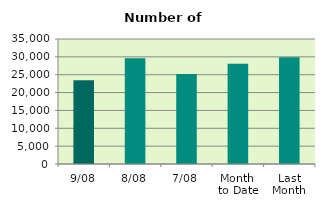
| Category | Series 0 |
|---|---|
| 9/08 | 23474 |
| 8/08 | 29626 |
| 7/08 | 25200 |
| Month 
to Date | 28091.714 |
| Last
Month | 29864.476 |